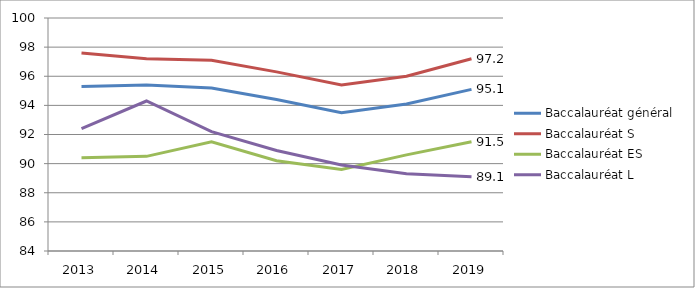
| Category | Baccalauréat général | Baccalauréat S | Baccalauréat ES | Baccalauréat L |
|---|---|---|---|---|
| 2013.0 | 95.3 | 97.6 | 90.4 | 92.4 |
| 2014.0 | 95.4 | 97.2 | 90.5 | 94.3 |
| 2015.0 | 95.2 | 97.1 | 91.5 | 92.2 |
| 2016.0 | 94.4 | 96.3 | 90.2 | 90.9 |
| 2017.0 | 93.5 | 95.4 | 89.6 | 89.9 |
| 2018.0 | 94.1 | 96 | 90.6 | 89.3 |
| 2019.0 | 95.1 | 97.2 | 91.5 | 89.1 |